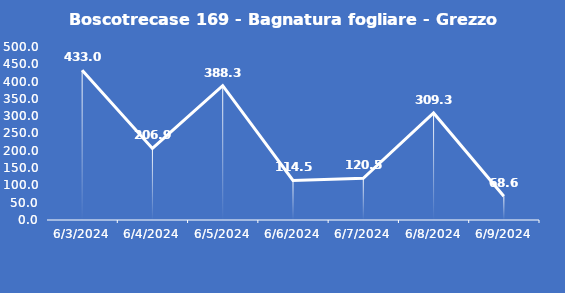
| Category | Boscotrecase 169 - Bagnatura fogliare - Grezzo (min) |
|---|---|
| 6/3/24 | 433 |
| 6/4/24 | 206.9 |
| 6/5/24 | 388.3 |
| 6/6/24 | 114.5 |
| 6/7/24 | 120.5 |
| 6/8/24 | 309.3 |
| 6/9/24 | 68.6 |